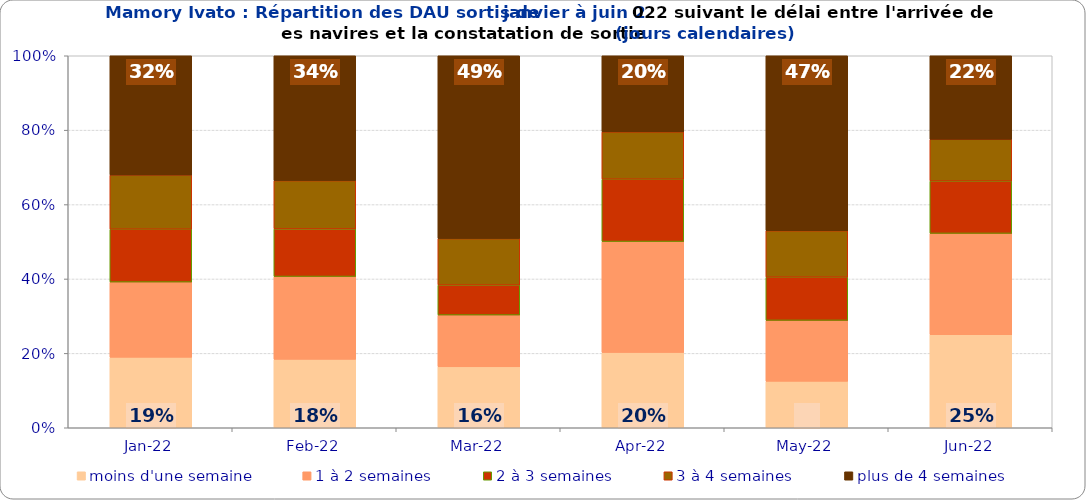
| Category | moins d'une semaine | 1 à 2 semaines | 2 à 3 semaines | 3 à 4 semaines | plus de 4 semaines |
|---|---|---|---|---|---|
| 2022-01-01 | 0.189 | 0.202 | 0.142 | 0.146 | 0.321 |
| 2022-02-01 | 0.184 | 0.223 | 0.128 | 0.13 | 0.336 |
| 2022-03-01 | 0.164 | 0.139 | 0.081 | 0.125 | 0.491 |
| 2022-04-01 | 0.202 | 0.298 | 0.168 | 0.127 | 0.205 |
| 2022-05-01 | 0.125 | 0.164 | 0.116 | 0.125 | 0.47 |
| 2022-06-01 | 0.25 | 0.272 | 0.141 | 0.112 | 0.224 |